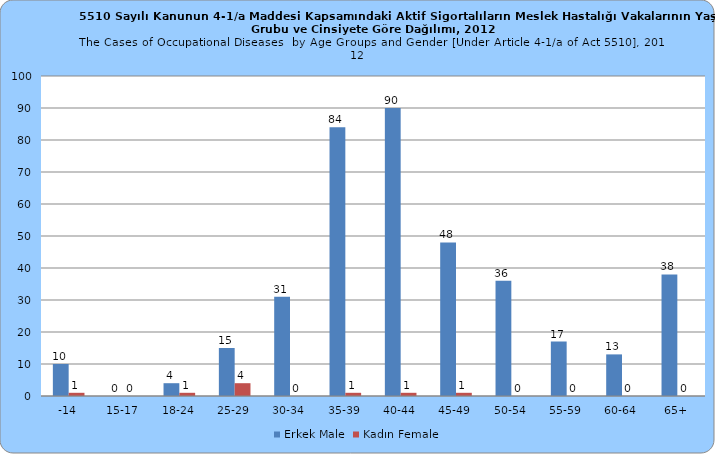
| Category | Erkek Male | Kadın Female |
|---|---|---|
| -14 | 10 | 1 |
| 15-17 | 0 | 0 |
| 18-24 | 4 | 1 |
| 25-29 | 15 | 4 |
| 30-34 | 31 | 0 |
| 35-39 | 84 | 1 |
| 40-44 | 90 | 1 |
| 45-49 | 48 | 1 |
| 50-54 | 36 | 0 |
| 55-59 | 17 | 0 |
| 60-64 | 13 | 0 |
| 65+ | 38 | 0 |